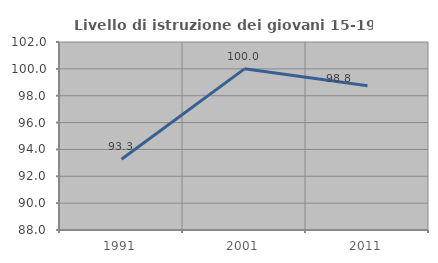
| Category | Livello di istruzione dei giovani 15-19 anni |
|---|---|
| 1991.0 | 93.269 |
| 2001.0 | 100 |
| 2011.0 | 98.75 |